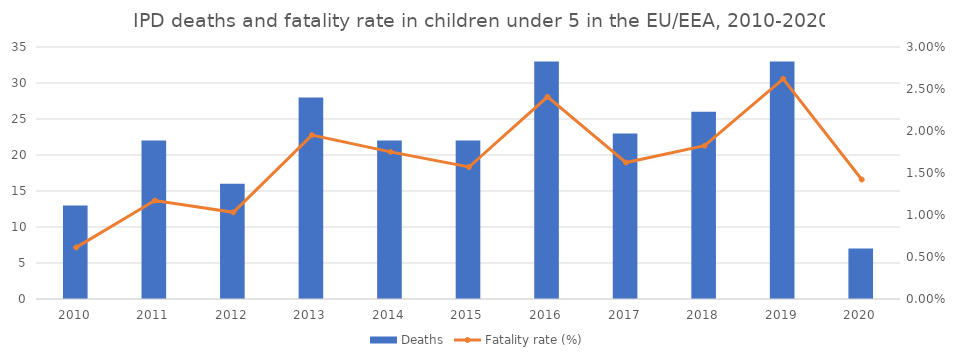
| Category | Deaths |
|---|---|
| 2010.0 | 13 |
| 2011.0 | 22 |
| 2012.0 | 16 |
| 2013.0 | 28 |
| 2014.0 | 22 |
| 2015.0 | 22 |
| 2016.0 | 33 |
| 2017.0 | 23 |
| 2018.0 | 26 |
| 2019.0 | 33 |
| 2020.0 | 7 |